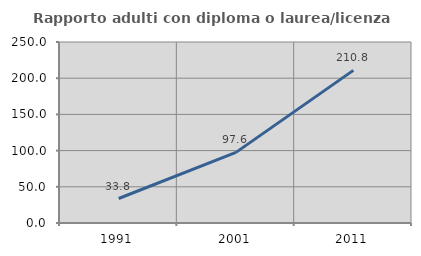
| Category | Rapporto adulti con diploma o laurea/licenza media  |
|---|---|
| 1991.0 | 33.829 |
| 2001.0 | 97.571 |
| 2011.0 | 210.811 |